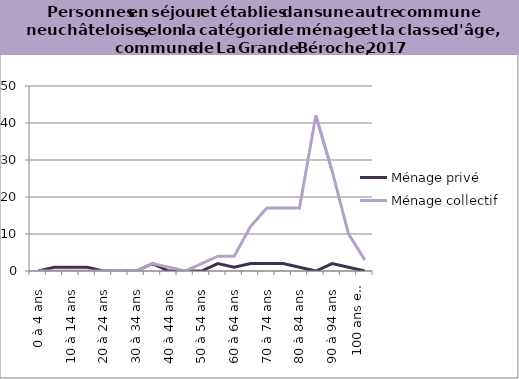
| Category | Ménage privé | Ménage collectif |
|---|---|---|
| 0 à 4 ans | 0 | 0 |
| 5 à 9 ans | 1 | 0 |
| 10 à 14 ans | 1 | 0 |
| 15 à 19 ans | 1 | 0 |
| 20 à 24 ans | 0 | 0 |
| 25 à 29 ans | 0 | 0 |
| 30 à 34 ans | 0 | 0 |
| 35 à 39 ans | 2 | 2 |
| 40 à 44 ans | 0 | 1 |
| 45 à 49 ans | 0 | 0 |
| 50 à 54 ans | 0 | 2 |
| 55 à 59 ans | 2 | 4 |
| 60 à 64 ans | 1 | 4 |
| 65 à 69 ans | 2 | 12 |
| 70 à 74 ans | 2 | 17 |
| 75 à 79 ans | 2 | 17 |
| 80 à 84 ans | 1 | 17 |
| 85 à 89 ans | 0 | 42 |
| 90 à 94 ans | 2 | 27 |
| 95 à 99 ans | 1 | 10 |
| 100 ans et plus | 0 | 3 |